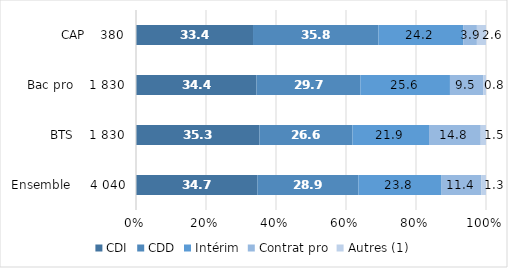
| Category | CDI | CDD | Intérim | Contrat pro | Autres (1) |
|---|---|---|---|---|---|
| Ensemble     4 040 | 34.7 | 28.9 | 23.8 | 11.4 | 1.3 |
| BTS    1 830 | 35.3 | 26.6 | 21.9 | 14.8 | 1.5 |
| Bac pro    1 830 | 34.4 | 29.7 | 25.6 | 9.5 | 0.8 |
| CAP    380 | 33.4 | 35.8 | 24.2 | 3.9 | 2.6 |